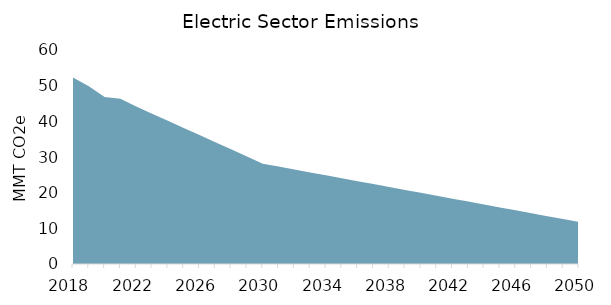
| Category |  Electric Emissions (MMT CO2e)  |
|---|---|
| 2018.0 | 52.318 |
| 2019.0 | 49.855 |
| 2020.0 | 46.833 |
| 2021.0 | 46.327 |
| 2022.0 | 44.133 |
| 2023.0 | 42.134 |
| 2024.0 | 40.135 |
| 2025.0 | 38.136 |
| 2026.0 | 36.137 |
| 2027.0 | 34.137 |
| 2028.0 | 32.138 |
| 2029.0 | 30.139 |
| 2030.0 | 28.14 |
| 2031.0 | 27.321 |
| 2032.0 | 26.502 |
| 2033.0 | 25.684 |
| 2034.0 | 24.865 |
| 2035.0 | 24.046 |
| 2036.0 | 23.227 |
| 2037.0 | 22.408 |
| 2038.0 | 21.589 |
| 2039.0 | 20.771 |
| 2040.0 | 19.952 |
| 2041.0 | 19.133 |
| 2042.0 | 18.314 |
| 2043.0 | 17.495 |
| 2044.0 | 16.676 |
| 2045.0 | 15.858 |
| 2046.0 | 15.039 |
| 2047.0 | 14.22 |
| 2048.0 | 13.401 |
| 2049.0 | 12.582 |
| 2050.0 | 11.764 |